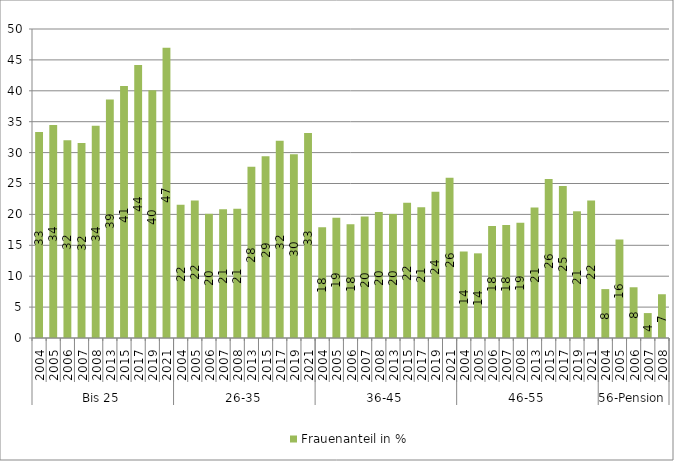
| Category | Frauenanteil in % |
|---|---|
| 0 | 33.333 |
| 1 | 34.457 |
| 2 | 31.985 |
| 3 | 31.56 |
| 4 | 34.348 |
| 5 | 38.596 |
| 6 | 40.761 |
| 7 | 44.175 |
| 8 | 40.076 |
| 9 | 46.965 |
| 10 | 21.56 |
| 11 | 22.245 |
| 12 | 20.095 |
| 13 | 20.833 |
| 14 | 20.933 |
| 15 | 27.715 |
| 16 | 29.412 |
| 17 | 31.899 |
| 18 | 29.745 |
| 19 | 33.191 |
| 20 | 17.938 |
| 21 | 19.441 |
| 22 | 18.414 |
| 23 | 19.664 |
| 24 | 20.373 |
| 25 | 20.076 |
| 26 | 21.882 |
| 27 | 21.168 |
| 28 | 23.662 |
| 29 | 25.95 |
| 30 | 13.993 |
| 31 | 13.699 |
| 32 | 18.125 |
| 33 | 18.266 |
| 34 | 18.638 |
| 35 | 21.118 |
| 36 | 25.747 |
| 37 | 24.609 |
| 38 | 20.503 |
| 39 | 22.24 |
| 40 | 7.914 |
| 41 | 15.957 |
| 42 | 8.209 |
| 43 | 4.032 |
| 44 | 7.08 |